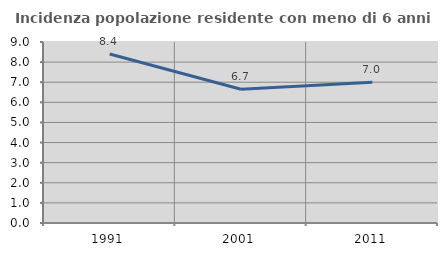
| Category | Incidenza popolazione residente con meno di 6 anni |
|---|---|
| 1991.0 | 8.407 |
| 2001.0 | 6.651 |
| 2011.0 | 6.994 |